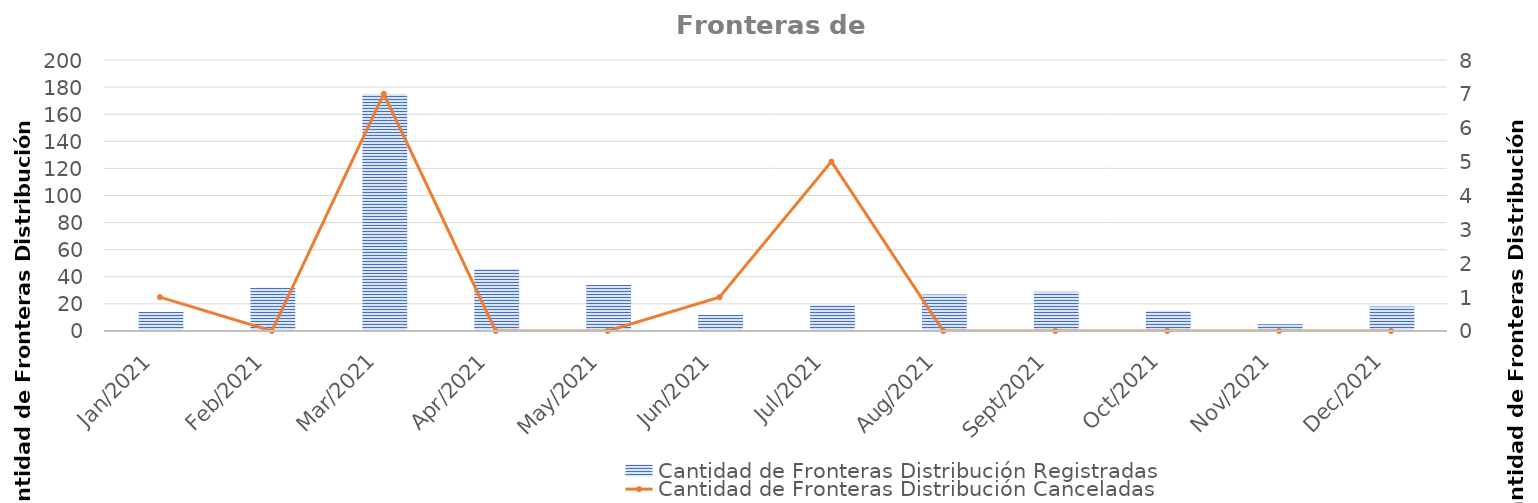
| Category | Cantidad de Fronteras Distribución Registradas |
|---|---|
| 2021-01-01 | 14 |
| 2021-02-01 | 32 |
| 2021-03-01 | 175 |
| 2021-04-01 | 46 |
| 2021-05-01 | 34 |
| 2021-06-01 | 12 |
| 2021-07-01 | 19 |
| 2021-08-01 | 27 |
| 2021-09-01 | 29 |
| 2021-10-01 | 15 |
| 2021-11-01 | 5 |
| 2021-12-01 | 18 |